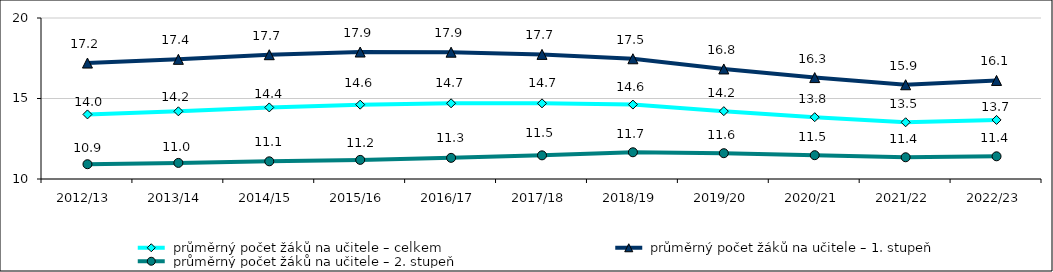
| Category |  průměrný počet žáků na učitele – celkem |  průměrný počet žáků na učitele – 1. stupeň |  průměrný počet žáků na učitele – 2. stupeň |
|---|---|---|---|
| 2012/13 | 14.01 | 17.202 | 10.918 |
| 2013/14 | 14.204 | 17.433 | 11 |
| 2014/15 | 14.445 | 17.719 | 11.099 |
| 2015/16 | 14.617 | 17.887 | 11.188 |
| 2016/17 | 14.703 | 17.876 | 11.314 |
| 2017/18 | 14.699 | 17.74 | 11.469 |
| 2018/19 | 14.623 | 17.467 | 11.66 |
| 2019/20 | 14.214 | 16.835 | 11.603 |
| 2020/21 | 13.84 | 16.299 | 11.479 |
| 2021/22 | 13.524 | 15.854 | 11.35 |
| 2022/23 | 13.669 | 16.121 | 11.41 |